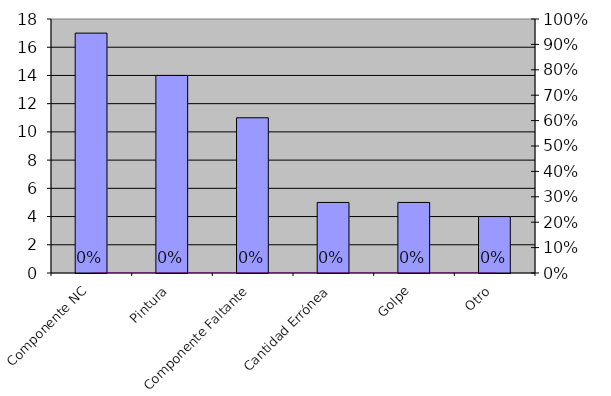
| Category | Series 0 |
|---|---|
| Componente NC | 17 |
| Pintura | 14 |
| Componente Faltante | 11 |
| Cantidad Errónea | 5 |
| Golpe | 5 |
| Otro | 4 |